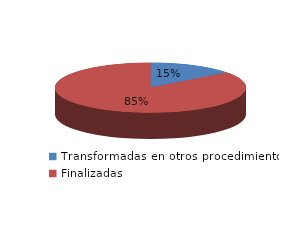
| Category | Series 0 |
|---|---|
| Transformadas en otros procedimientos | 4727 |
| Finalizadas | 27792 |